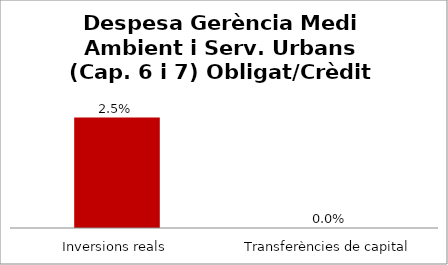
| Category | Series 0 |
|---|---|
| Inversions reals | 0.025 |
| Transferències de capital | 0 |